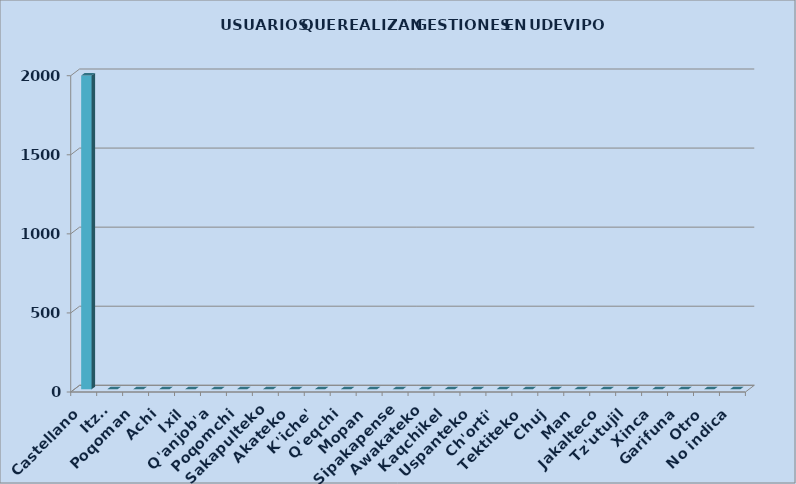
| Category | Series 0 |
|---|---|
| Castellano | 1984 |
| Itza' | 0 |
| Poqoman | 0 |
| Achi | 0 |
| Ixil | 0 |
| Q'anjob'a | 0 |
| Poqomchi | 0 |
| Sakapulteko | 0 |
| Akateko | 0 |
| K'iche' | 0 |
| Q'eqchi | 0 |
| Mopan | 0 |
| Sipakapense | 0 |
| Awakateko | 0 |
| Kaqchikel | 0 |
| Uspanteko | 0 |
| Ch'orti' | 0 |
| Tektiteko | 0 |
| Chuj | 0 |
| Man | 0 |
| Jakalteco | 0 |
| Tz'utujil | 0 |
| Xinca | 0 |
| Garifuna | 0 |
| Otro | 0 |
| No indica | 0 |